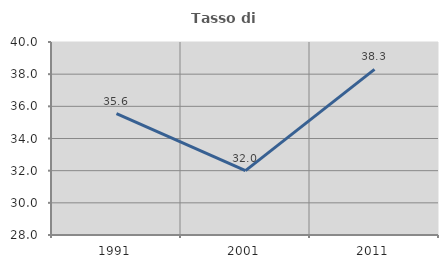
| Category | Tasso di occupazione   |
|---|---|
| 1991.0 | 35.554 |
| 2001.0 | 32.003 |
| 2011.0 | 38.294 |